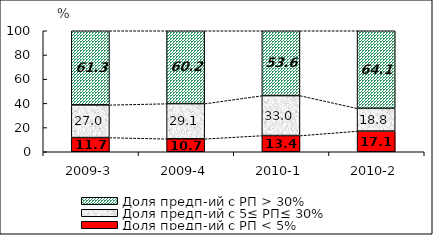
| Category | Доля предп-ий с РП < 5% | Доля предп-ий с 5≤ РП≤ 30% | Доля предп-ий с РП > 30% |
|---|---|---|---|
| 2009-3 | 11.736 | 27.006 | 61.258 |
| 2009-4 | 10.696 | 29.1 | 60.204 |
| 2010-1 | 13.413 | 33.016 | 53.571 |
| 2010-2 | 17.094 | 18.803 | 64.103 |